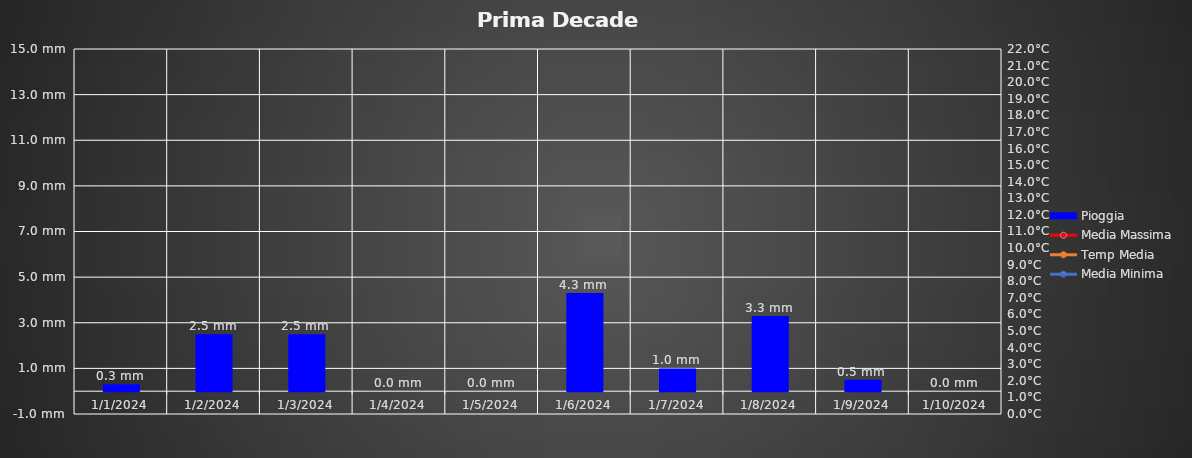
| Category | Pioggia |
|---|---|
| 1/1/24 | 0.3 |
| 1/2/24 | 1900-01-02 12:00:00 |
| 1/3/24 | 1900-01-02 12:00:00 |
| 1/4/24 | 0 |
| 1/5/24 | 0 |
| 1/6/24 | 1900-01-04 07:12:00 |
| 1/7/24 | 1900-01-01 |
| 1/8/24 | 1900-01-03 07:12:00 |
| 1/9/24 | 0.5 |
| 1/10/24 | 0 |